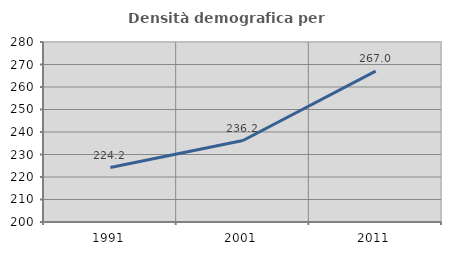
| Category | Densità demografica |
|---|---|
| 1991.0 | 224.189 |
| 2001.0 | 236.212 |
| 2011.0 | 267.024 |